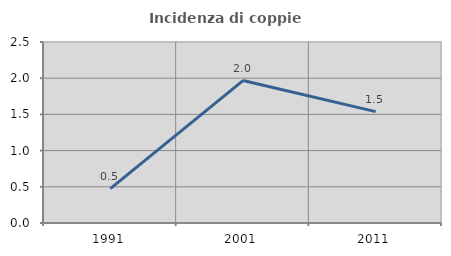
| Category | Incidenza di coppie miste |
|---|---|
| 1991.0 | 0.475 |
| 2001.0 | 1.967 |
| 2011.0 | 1.538 |